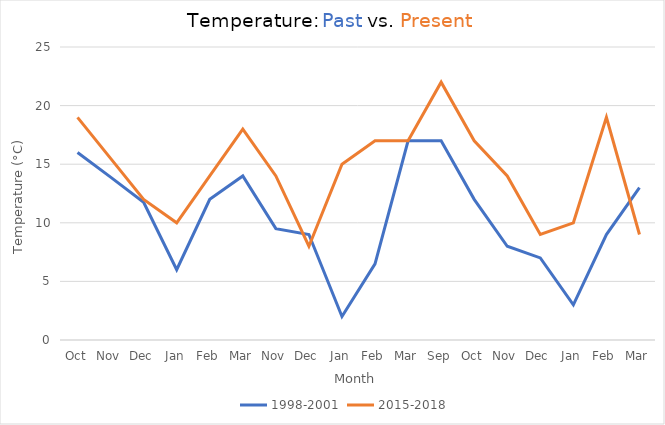
| Category | 1998-2001 | 2015-2018 |
|---|---|---|
| Oct | 16 | 19 |
| Nov | 13.9 | 15.5 |
| Dec | 11.75 | 12 |
| Jan | 6 | 10 |
| Feb | 12 | 14 |
| Mar | 14 | 18 |
| Nov | 9.5 | 14 |
| Dec | 9 | 8 |
| Jan | 2 | 15 |
| Feb | 6.5 | 17 |
| Mar | 17 | 17 |
| Sep | 17 | 22 |
| Oct | 12 | 17 |
| Nov | 8 | 14 |
| Dec | 7 | 9 |
| Jan | 3 | 10 |
| Feb | 9 | 19 |
| Mar | 13 | 9 |